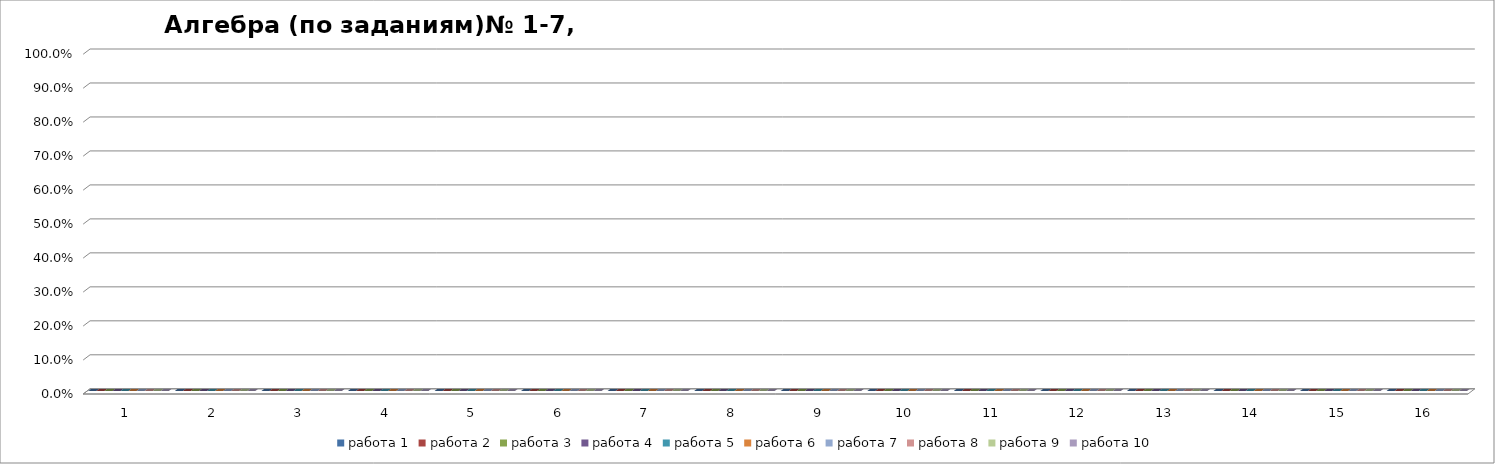
| Category | работа 1 | работа 2 | работа 3 | работа 4 | работа 5 | работа 6 | работа 7 | работа 8 | работа 9 | работа 10 |
|---|---|---|---|---|---|---|---|---|---|---|
| 0 | 0 | 0 | 0 | 0 | 0 | 0 | 0 | 0 | 0 | 0 |
| 1 | 0 | 0 | 0 | 0 | 0 | 0 | 0 | 0 | 0 | 0 |
| 2 | 0 | 0 | 0 | 0 | 0 | 0 | 0 | 0 | 0 | 0 |
| 3 | 0 | 0 | 0 | 0 | 0 | 0 | 0 | 0 | 0 | 0 |
| 4 | 0 | 0 | 0 | 0 | 0 | 0 | 0 | 0 | 0 | 0 |
| 5 | 0 | 0 | 0 | 0 | 0 | 0 | 0 | 0 | 0 | 0 |
| 6 | 0 | 0 | 0 | 0 | 0 | 0 | 0 | 0 | 0 | 0 |
| 7 | 0 | 0 | 0 | 0 | 0 | 0 | 0 | 0 | 0 | 0 |
| 8 | 0 | 0 | 0 | 0 | 0 | 0 | 0 | 0 | 0 | 0 |
| 9 | 0 | 0 | 0 | 0 | 0 | 0 | 0 | 0 | 0 | 0 |
| 10 | 0 | 0 | 0 | 0 | 0 | 0 | 0 | 0 | 0 | 0 |
| 11 | 0 | 0 | 0 | 0 | 0 | 0 | 0 | 0 | 0 | 0 |
| 12 | 0 | 0 | 0 | 0 | 0 | 0 | 0 | 0 | 0 | 0 |
| 13 | 0 | 0 | 0 | 0 | 0 | 0 | 0 | 0 | 0 | 0 |
| 14 | 0 | 0 | 0 | 0 | 0 | 0 | 0 | 0 | 0 | 0 |
| 15 | 0 | 0 | 0 | 0 | 0 | 0 | 0 | 0 | 0 | 0 |